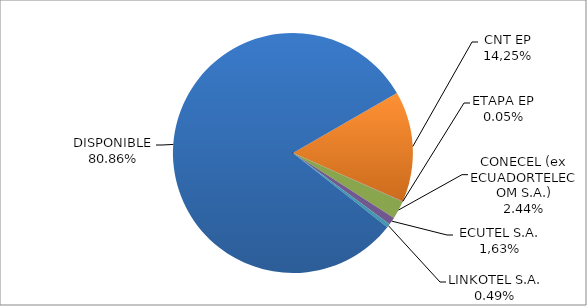
| Category | CODIGO DE AREA 4 |
|---|---|
| CORPORACIÓN NACIONAL TELECOMUNICACIONES CNT EP | 0.149 |
| ETAPA EP | 0.001 |
| CONECEL (ex ECUADORTELECOM S.A.) | 0.024 |
| SETEL S.A. | 0.01 |
| LINKOTEL S.A. | 0.005 |
| DISPONIBLE | 0.809 |